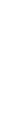
| Category | Series 0 | Series 1 | Series 2 | Series 3 |
|---|---|---|---|---|
| 0 |  | 1 |  |  |